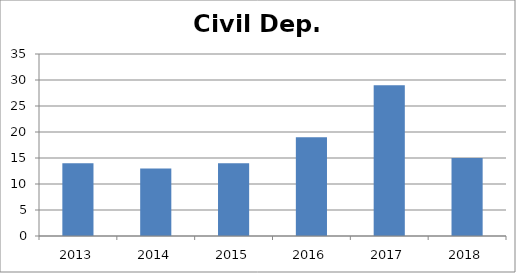
| Category | Civil Dep. Publications |
|---|---|
| 0 | 14 |
| 1 | 13 |
| 2 | 14 |
| 3 | 19 |
| 4 | 29 |
| 5 | 15 |